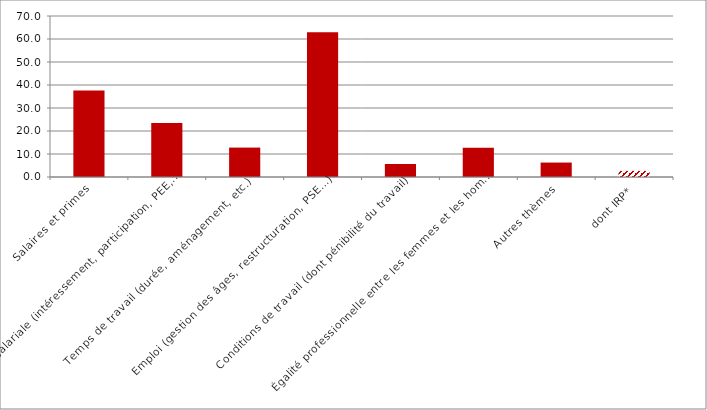
| Category | Series 0 |
|---|---|
| Salaires et primes | 37.66 |
| Épargne salariale (intéressement, participation, PEE, etc.) | 23.48 |
| Temps de travail (durée, aménagement, etc.) | 12.79 |
| Emploi (gestion des âges, restructuration, PSE…) | 62.96 |
| Conditions de travail (dont pénibilité du travail) | 5.62 |
| Égalité professionnelle entre les femmes et les hommes  | 12.72 |
| Autres thèmes | 6.28 |
| dont IRP* | 2.65 |